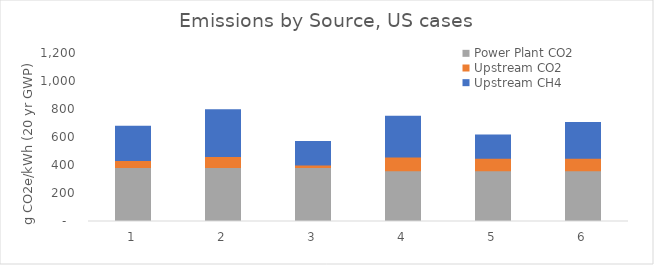
| Category | Power Plant CO2 | Upstream CO2 | Upstream CH4 |
|---|---|---|---|
| 1.0 | 386.243 | 48.927 | 245.965 |
| 2.0 | 386.243 | 77.19 | 335.555 |
| 3.0 | 386.243 | 17.954 | 166.734 |
| 4.0 | 363.237 | 97.07 | 291.329 |
| 5.0 | 363.237 | 89.229 | 164.754 |
| 6.0 | 363.237 | 88.847 | 255.742 |